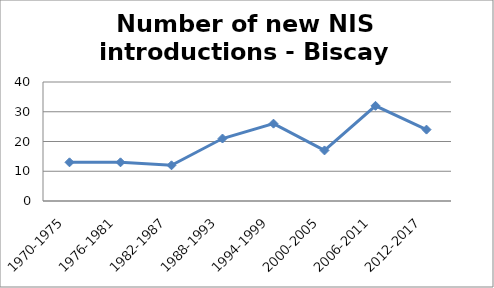
| Category | Number of new NIS introductions - Biscay Bay |
|---|---|
| 1970-1975 | 13 |
| 1976-1981 | 13 |
| 1982-1987 | 12 |
| 1988-1993 | 21 |
| 1994-1999 | 26 |
| 2000-2005 | 17 |
| 2006-2011 | 32 |
| 2012-2017 | 24 |